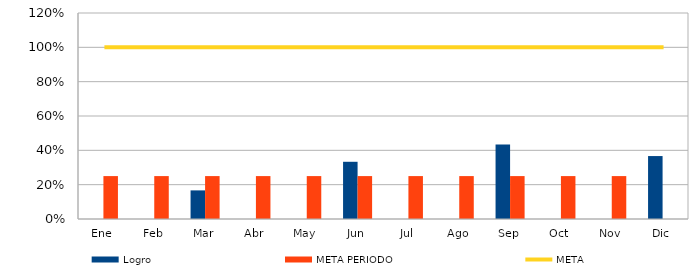
| Category | Logro  | META PERIODO |
|---|---|---|
| Ene | 0 | 0.25 |
| Feb | 0 | 0.25 |
| Mar | 0.167 | 0.25 |
| Abr | 0 | 0.25 |
| May | 0 | 0.25 |
| Jun | 0.333 | 0.25 |
| Jul | 0 | 0.25 |
| Ago | 0 | 0.25 |
| Sep | 0.433 | 0.25 |
| Oct | 0 | 0.25 |
| Nov | 0 | 0.25 |
| Dic | 0.367 | 0 |